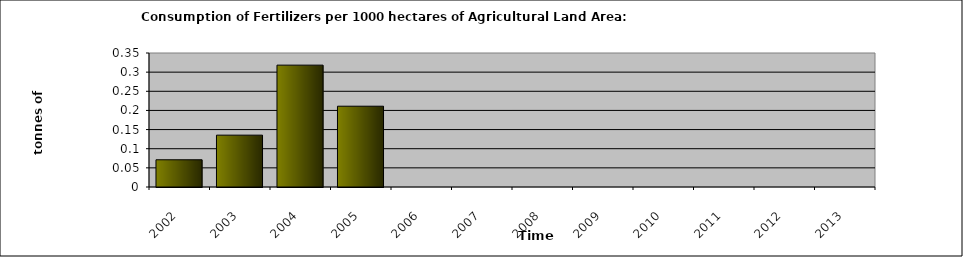
| Category | Series 0 |
|---|---|
| 2002.0 | 0.071 |
| 2003.0 | 0.135 |
| 2004.0 | 0.318 |
| 2005.0 | 0.211 |
| 2006.0 | 0 |
| 2007.0 | 0 |
| 2008.0 | 0 |
| 2009.0 | 0 |
| 2010.0 | 0 |
| 2011.0 | 0 |
| 2012.0 | 0 |
| 2013.0 | 0 |